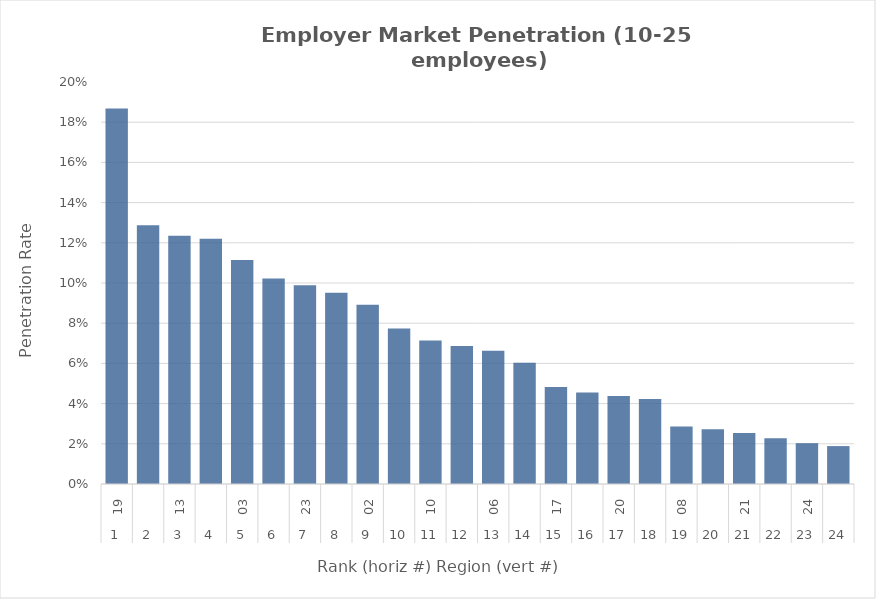
| Category | Rate |
|---|---|
| 0 | 0.187 |
| 1 | 0.129 |
| 2 | 0.124 |
| 3 | 0.122 |
| 4 | 0.111 |
| 5 | 0.102 |
| 6 | 0.099 |
| 7 | 0.095 |
| 8 | 0.089 |
| 9 | 0.077 |
| 10 | 0.071 |
| 11 | 0.069 |
| 12 | 0.066 |
| 13 | 0.06 |
| 14 | 0.048 |
| 15 | 0.046 |
| 16 | 0.044 |
| 17 | 0.042 |
| 18 | 0.029 |
| 19 | 0.027 |
| 20 | 0.025 |
| 21 | 0.023 |
| 22 | 0.02 |
| 23 | 0.019 |